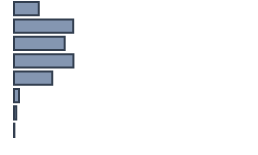
| Category | Percentatge |
|---|---|
| 0 | 10.347 |
| 1 | 24.67 |
| 2 | 21.114 |
| 3 | 24.762 |
| 4 | 15.941 |
| 5 | 2.072 |
| 6 | 0.937 |
| 7 | 0.158 |